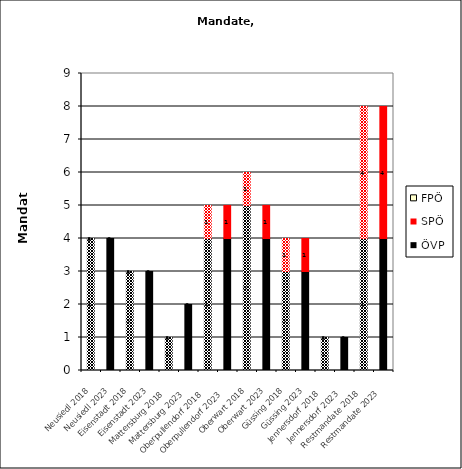
| Category | ÖVP | SPÖ | FPÖ |
|---|---|---|---|
| Neusiedl 2018 | 4 | 0 | 0 |
| Neusiedl 2023 | 4 | 0 | 0 |
| Eisenstadt 2018 | 3 | 0 | 0 |
| Eisenstadt 2023 | 3 | 0 | 0 |
| Mattersburg 2018 | 1 | 0 | 0 |
| Mattersburg 2023 | 2 | 0 | 0 |
| Oberpullendorf 2018 | 4 | 1 | 0 |
| Oberpullendorf 2023 | 4 | 1 | 0 |
| Oberwart 2018 | 5 | 1 | 0 |
| Oberwart 2023 | 4 | 1 | 0 |
| Güssing 2018 | 3 | 1 | 0 |
| Güssing 2023 | 3 | 1 | 0 |
| Jennersdorf 2018 | 1 | 0 | 0 |
| Jennersdorf 2023 | 1 | 0 | 0 |
| Restmandate 2018 | 4 | 4 | 0 |
| Restmandate 2023 | 4 | 4 | 0 |